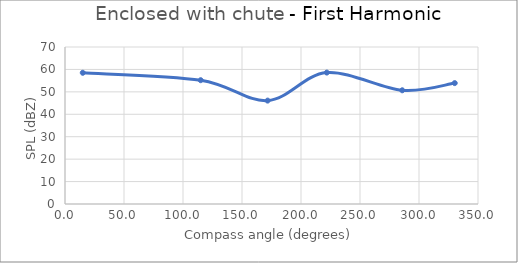
| Category | Series 0 |
|---|---|
| 15.06445125542554 | 58.5 |
| 115.00449447818254 | 55.2 |
| 171.7068171198818 | 46.1 |
| 221.8691292075067 | 58.6 |
| 285.7828166838848 | 50.7 |
| 330.28010595813004 | 53.9 |